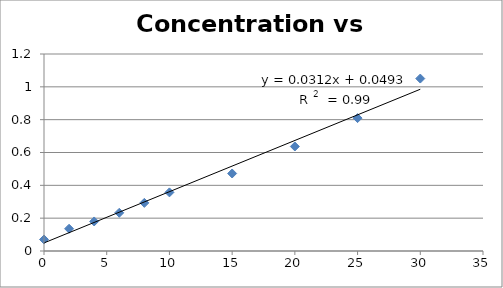
| Category | Absorbance  |
|---|---|
| 30.0 | 1.05 |
| 25.0 | 0.809 |
| 20.0 | 0.637 |
| 15.0 | 0.472 |
| 10.0 | 0.357 |
| 8.0 | 0.293 |
| 6.0 | 0.233 |
| 4.0 | 0.18 |
| 2.0 | 0.136 |
| 0.0 | 0.07 |